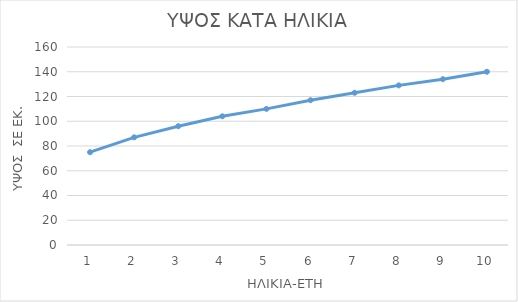
| Category | Series 0 |
|---|---|
| 0 | 75 |
| 1 | 87 |
| 2 | 96 |
| 3 | 104 |
| 4 | 110 |
| 5 | 117 |
| 6 | 123 |
| 7 | 129 |
| 8 | 134 |
| 9 | 140 |